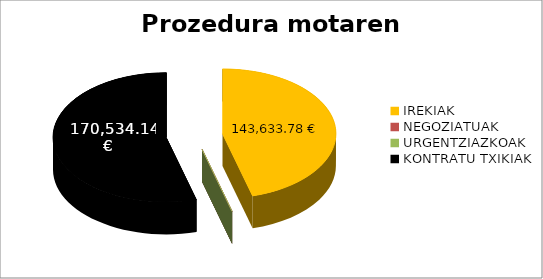
| Category | Prozedura motaren arabera |
|---|---|
| IREKIAK | 143633.78 |
| NEGOZIATUAK | 0 |
| URGENTZIAZKOAK | 0 |
| KONTRATU TXIKIAK | 170534.14 |